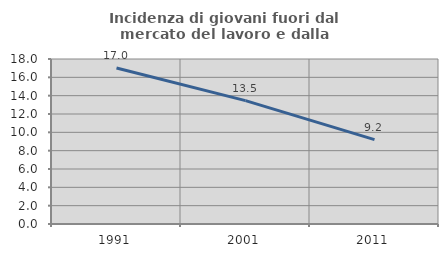
| Category | Incidenza di giovani fuori dal mercato del lavoro e dalla formazione  |
|---|---|
| 1991.0 | 17.024 |
| 2001.0 | 13.462 |
| 2011.0 | 9.211 |